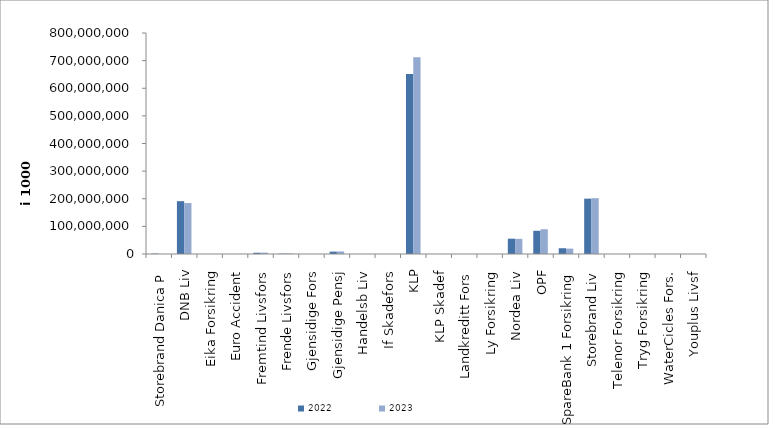
| Category | 2022 | 2023 |
|---|---|---|
| Storebrand Danica P | 1409067.966 | 0 |
| DNB Liv | 191155192 | 184410173.077 |
| Eika Forsikring | 0 | 0 |
| Euro Accident | 0 | 0 |
| Fremtind Livsfors | 4531256.157 | 5044781.403 |
| Frende Livsfors | 1351782 | 1693509 |
| Gjensidige Fors | 0 | 0 |
| Gjensidige Pensj | 8598193 | 9260165 |
| Handelsb Liv | 25475.116 | 0 |
| If Skadefors | 0 | 0 |
| KLP | 651822235.957 | 712385364.218 |
| KLP Skadef | 90495.556 | 122314.744 |
| Landkreditt Fors | 0 | 0 |
| Ly Forsikring | 0 | 0 |
| Nordea Liv | 55369880 | 54766920 |
| OPF | 84051000 | 89562000 |
| SpareBank 1 Forsikring | 20841895.884 | 19477675.069 |
| Storebrand Liv | 200339753.172 | 202047929.344 |
| Telenor Forsikring | 0 | 0 |
| Tryg Forsikring | 0 | 0 |
| WaterCicles Fors. | 0 | 0 |
| Youplus Livsf | 1794 | 8446 |